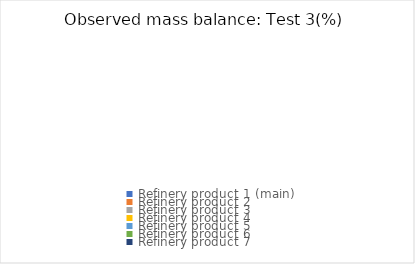
| Category | Test 3(%) |
|---|---|
| Refinery product 1 (main) | 0 |
| Refinery product 2 | 0 |
| Refinery product 3 | 0 |
| Refinery product 4 | 0 |
| Refinery product 5 | 0 |
| Refinery product 6 | 0 |
| Refinery product 7 | 0 |